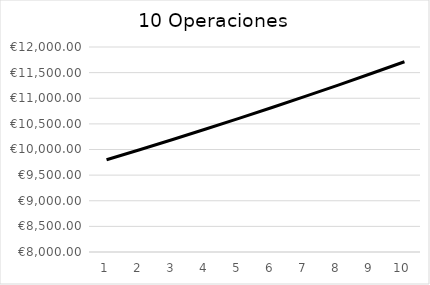
| Category | Series 0 |
|---|---|
| 0 | 9800 |
| 1 | 9996 |
| 2 | 10195.92 |
| 3 | 10399.838 |
| 4 | 10607.835 |
| 5 | 10819.992 |
| 6 | 11036.392 |
| 7 | 11257.12 |
| 8 | 11482.262 |
| 9 | 11711.907 |